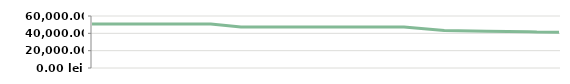
| Category | TRIMESTRU   |
|---|---|
| 2013-04-23 | 50800 |
| 2013-04-25 | 50800 |
| 2013-05-07 | 50800 |
| 2013-05-14 | 50800 |
| 2013-05-14 | 50800 |
| 2013-05-29 | 50800 |
| 2013-06-10 | 50800 |
| 2013-06-21 | 50800 |
| 2013-07-06 | 47400 |
| 2013-08-05 | 47400 |
| 2013-08-19 | 47400 |
| 2013-09-04 | 47400 |
| 2013-09-20 | 47400 |
| 2013-09-25 | 47400 |
| 2013-10-15 | 43258.14 |
| 2013-11-05 | 42312.903 |
| 2013-11-26 | 41811.111 |
| 2013-11-30 | 41500 |
| 2013-12-11 | 41288.235 |